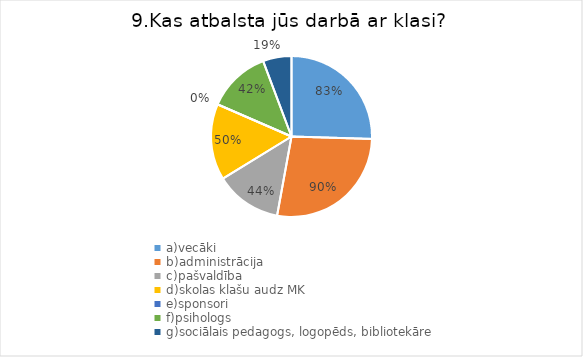
| Category | Series 0 |
|---|---|
| a)vecāki | 0.833 |
| b)administrācija | 0.896 |
| c)pašvaldība | 0.438 |
| d)skolas klašu audz MK | 0.5 |
| e)sponsori | 0 |
| f)psihologs | 0.417 |
| g)sociālais pedagogs, logopēds, bibliotekāre | 0.188 |